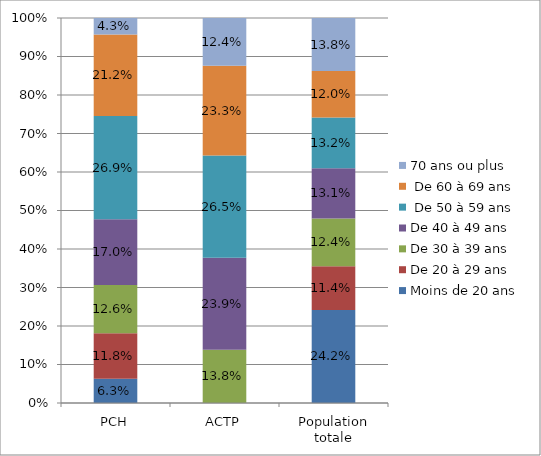
| Category | Moins de 20 ans  | De 20 à 29 ans | De 30 à 39 ans | De 40 à 49 ans |  De 50 à 59 ans |  De 60 à 69 ans | 70 ans ou plus |
|---|---|---|---|---|---|---|---|
| PCH | 0.063 | 0.118 | 0.126 | 0.17 | 0.269 | 0.212 | 0.043 |
| ACTP | 0 | 0 | 0.138 | 0.239 | 0.265 | 0.233 | 0.124 |
| Population totale | 0.242 | 0.114 | 0.124 | 0.131 | 0.132 | 0.12 | 0.138 |